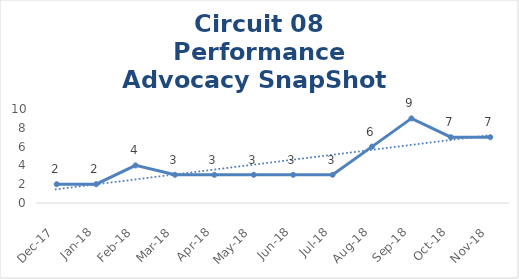
| Category | Circuit 08 |
|---|---|
| Dec-17 | 2 |
| Jan-18 | 2 |
| Feb-18 | 4 |
| Mar-18 | 3 |
| Apr-18 | 3 |
| May-18 | 3 |
| Jun-18 | 3 |
| Jul-18 | 3 |
| Aug-18 | 6 |
| Sep-18 | 9 |
| Oct-18 | 7 |
| Nov-18 | 7 |